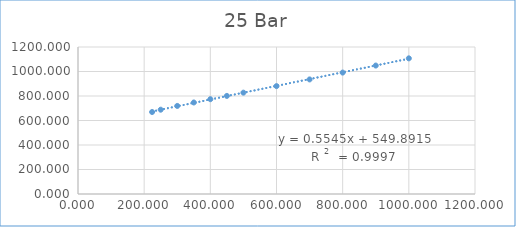
| Category | Series 0 |
|---|---|
| 224.0 | 669.35 |
| 250.0 | 688.223 |
| 300.0 | 718.968 |
| 350.0 | 747.014 |
| 400.0 | 774.032 |
| 450.0 | 800.669 |
| 500.0 | 827.21 |
| 600.0 | 880.745 |
| 700.0 | 935.308 |
| 800.0 | 991.209 |
| 900.0 | 1048.567 |
| 1000.0 | 1107.406 |